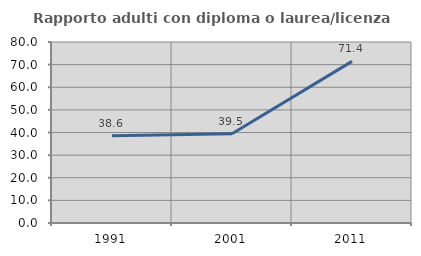
| Category | Rapporto adulti con diploma o laurea/licenza media  |
|---|---|
| 1991.0 | 38.596 |
| 2001.0 | 39.474 |
| 2011.0 | 71.429 |